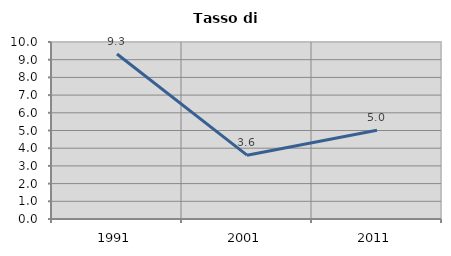
| Category | Tasso di disoccupazione   |
|---|---|
| 1991.0 | 9.321 |
| 2001.0 | 3.606 |
| 2011.0 | 5.016 |